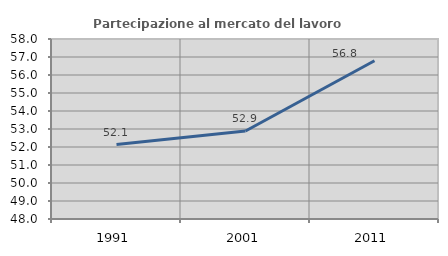
| Category | Partecipazione al mercato del lavoro  femminile |
|---|---|
| 1991.0 | 52.136 |
| 2001.0 | 52.886 |
| 2011.0 | 56.789 |